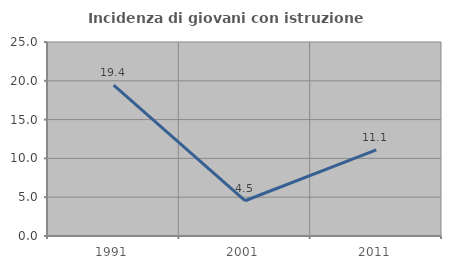
| Category | Incidenza di giovani con istruzione universitaria |
|---|---|
| 1991.0 | 19.444 |
| 2001.0 | 4.545 |
| 2011.0 | 11.111 |